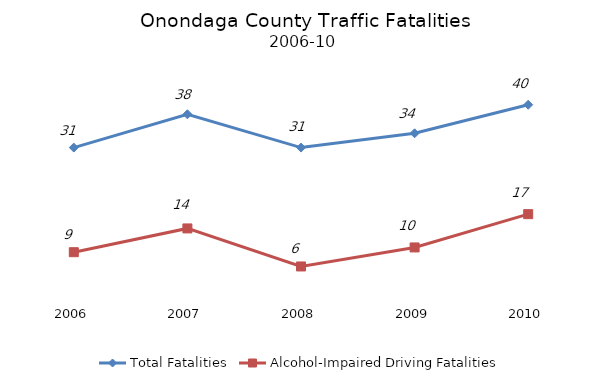
| Category | Total Fatalities | Alcohol-Impaired Driving Fatalities |
|---|---|---|
| 2006.0 | 31 | 9 |
| 2007.0 | 38 | 14 |
| 2008.0 | 31 | 6 |
| 2009.0 | 34 | 10 |
| 2010.0 | 40 | 17 |